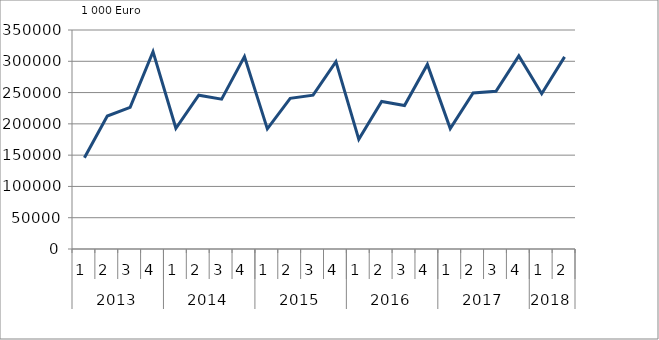
| Category | Ausbaugewerblicher Umsatz3 |
|---|---|
| 0 | 145792.596 |
| 1 | 212577 |
| 2 | 226327.748 |
| 3 | 315433.896 |
| 4 | 193004.858 |
| 5 | 245754.159 |
| 6 | 239547.85 |
| 7 | 307688.935 |
| 8 | 192043.756 |
| 9 | 240826.879 |
| 10 | 245916.087 |
| 11 | 299455.378 |
| 12 | 175225.59 |
| 13 | 235781.631 |
| 14 | 229227.559 |
| 15 | 294992.157 |
| 16 | 192499.539 |
| 17 | 249394.388 |
| 18 | 252146.755 |
| 19 | 308653.153 |
| 20 | 248133.418 |
| 21 | 307099.899 |